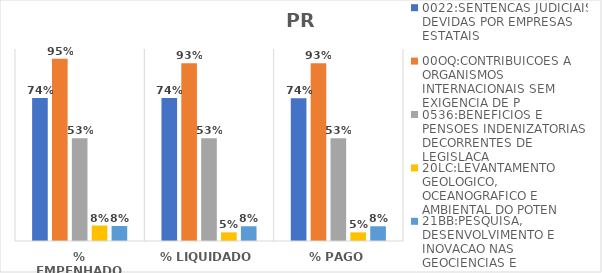
| Category | 0022:SENTENCAS JUDICIAIS DEVIDAS POR EMPRESAS ESTATAIS | 00OQ:CONTRIBUICOES A ORGANISMOS INTERNACIONAIS SEM EXIGENCIA DE P | 0536:BENEFICIOS E PENSOES INDENIZATORIAS DECORRENTES DE LEGISLACA | 20LC:LEVANTAMENTO GEOLOGICO, OCEANOGRAFICO E AMBIENTAL DO POTEN | 21BB:PESQUISA, DESENVOLVIMENTO E INOVACAO NAS GEOCIENCIAS E |
|---|---|---|---|---|---|
| % EMPENHADO | 0.744 | 0.95 | 0.535 | 0.081 | 0.078 |
| % LIQUIDADO | 0.744 | 0.926 | 0.535 | 0.045 | 0.077 |
| % PAGO | 0.744 | 0.926 | 0.535 | 0.045 | 0.077 |